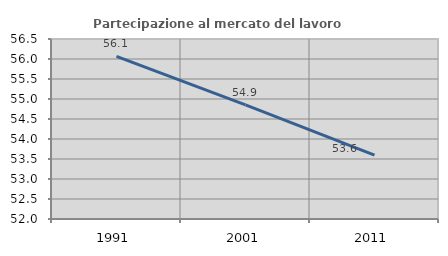
| Category | Partecipazione al mercato del lavoro  femminile |
|---|---|
| 1991.0 | 56.064 |
| 2001.0 | 54.852 |
| 2011.0 | 53.599 |